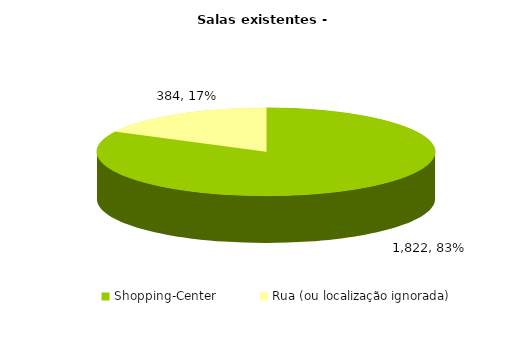
| Category | Series 0 |
|---|---|
| Shopping-Center | 1822 |
| Rua (ou localização ignorada) | 384 |